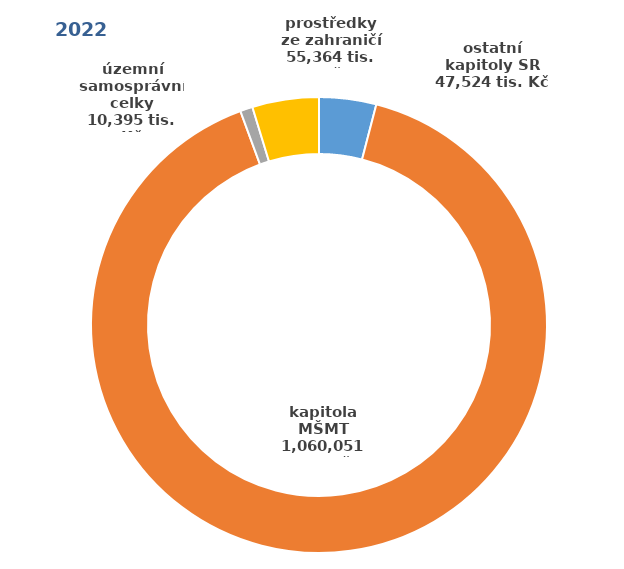
| Category | 2022 |
|---|---|
| ostatní kapitoly SR | 47524 |
| kapitola MŠMT | 1060051 |
| územní samosprávní celky | 10395 |
| prostředky ze zahraničí | 55364 |